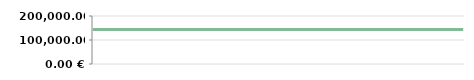
| Category | ANO  |
|---|---|
| 2013-04-23 | 143800 |
| 2013-04-25 | 143800 |
| 2013-05-07 | 143800 |
| 2013-05-14 | 143800 |
| 2013-05-14 | 143800 |
| 2013-05-29 | 143800 |
| 2013-06-10 | 143800 |
| 2013-06-21 | 143800 |
| 2013-07-06 | 143800 |
| 2013-08-05 | 143800 |
| 2013-08-19 | 143800 |
| 2013-09-04 | 143800 |
| 2013-09-20 | 143800 |
| 2013-09-25 | 143800 |
| 2013-10-15 | 143800 |
| 2013-11-05 | 143800 |
| 2013-11-26 | 143800 |
| 2013-11-30 | 143800 |
| 2013-12-11 | 143800 |